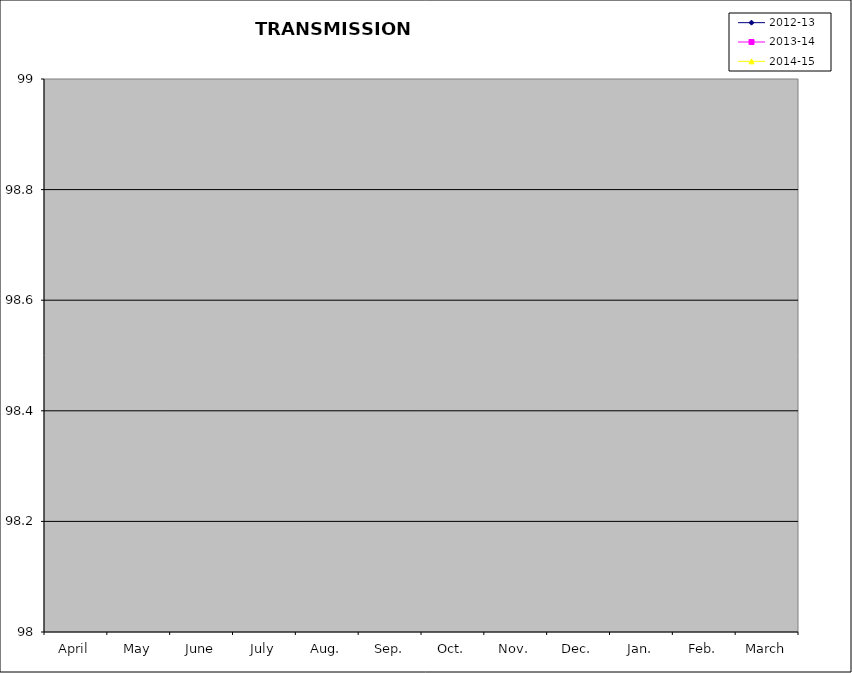
| Category | 2012-13 | 2013-14 | 2014-15 |
|---|---|---|---|
| April | 0.01 | 0.01 | 0.01 |
| May | 0.01 | 0.01 | 0.01 |
| June | 0.01 | 0.01 | 0.01 |
| July | 0.01 | 0.01 | 0.01 |
| Aug. | 0.01 | 0.01 | 0.01 |
| Sep. | 0.01 | 0.01 | 0.01 |
| Oct. | 0.01 | 0.01 | 0.01 |
| Nov. | 0.01 | 0.01 | 0.01 |
| Dec. | 0.01 | 0.01 | 0.01 |
| Jan. | 0.01 | 0.01 | 0.01 |
| Feb. | 0.01 | 0.01 | 0.01 |
| March | 0.01 | 0.01 | 0.01 |